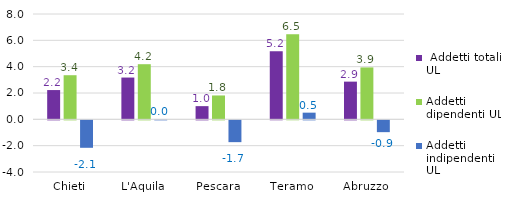
| Category |  Addetti totali UL | Addetti dipendenti UL | Addetti indipendenti UL |
|---|---|---|---|
| Chieti | 2.223 | 3.35 | -2.086 |
| L'Aquila | 3.173 | 4.187 | 0.005 |
| Pescara | 1.002 | 1.813 | -1.657 |
| Teramo | 5.168 | 6.456 | 0.507 |
| Abruzzo | 2.864 | 3.942 | -0.898 |